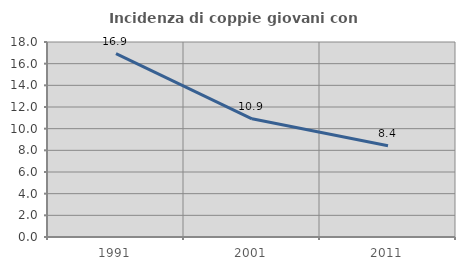
| Category | Incidenza di coppie giovani con figli |
|---|---|
| 1991.0 | 16.934 |
| 2001.0 | 10.908 |
| 2011.0 | 8.428 |